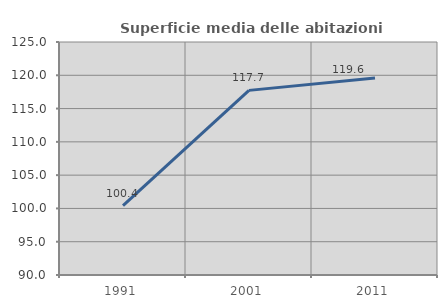
| Category | Superficie media delle abitazioni occupate |
|---|---|
| 1991.0 | 100.429 |
| 2001.0 | 117.733 |
| 2011.0 | 119.604 |